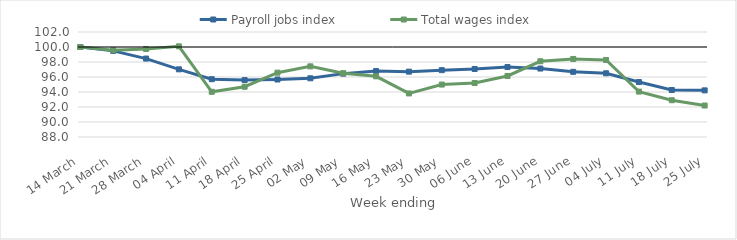
| Category | Payroll jobs index | Total wages index |
|---|---|---|
| 2020-03-14 | 100 | 100 |
| 2020-03-21 | 99.483 | 99.563 |
| 2020-03-28 | 98.457 | 99.734 |
| 2020-04-04 | 97.021 | 100.085 |
| 2020-04-11 | 95.707 | 94.025 |
| 2020-04-18 | 95.586 | 94.7 |
| 2020-04-25 | 95.667 | 96.578 |
| 2020-05-02 | 95.829 | 97.421 |
| 2020-05-09 | 96.449 | 96.502 |
| 2020-05-16 | 96.792 | 96.089 |
| 2020-05-23 | 96.713 | 93.807 |
| 2020-05-30 | 96.912 | 94.991 |
| 2020-06-06 | 97.069 | 95.2 |
| 2020-06-13 | 97.325 | 96.139 |
| 2020-06-20 | 97.128 | 98.099 |
| 2020-06-27 | 96.69 | 98.408 |
| 2020-07-04 | 96.494 | 98.273 |
| 2020-07-11 | 95.324 | 94.055 |
| 2020-07-18 | 94.267 | 92.906 |
| 2020-07-25 | 94.217 | 92.196 |